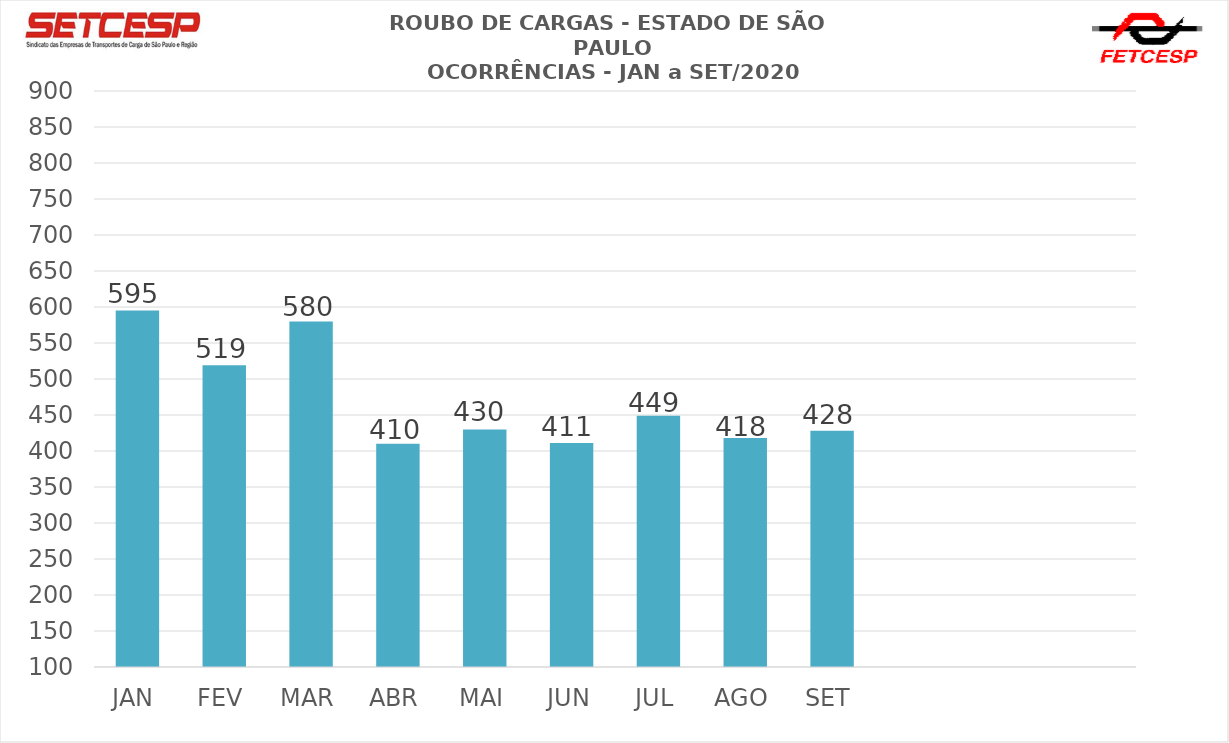
| Category | Series 2 |
|---|---|
| JAN | 595 |
| FEV | 519 |
| MAR | 580 |
| ABR | 410 |
| MAI | 430 |
| JUN | 411 |
| JUL | 449 |
| AGO | 418 |
| SET | 428 |